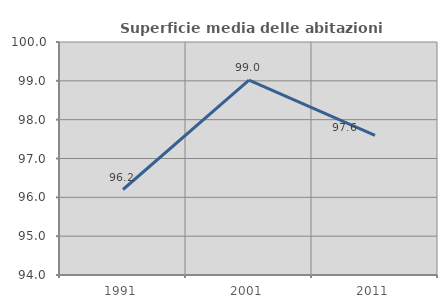
| Category | Superficie media delle abitazioni occupate |
|---|---|
| 1991.0 | 96.202 |
| 2001.0 | 99.016 |
| 2011.0 | 97.598 |